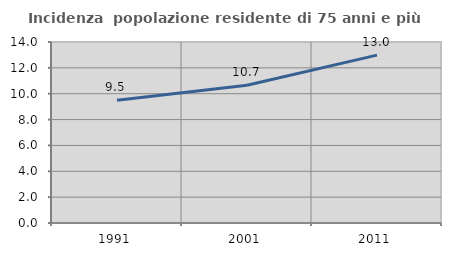
| Category | Incidenza  popolazione residente di 75 anni e più |
|---|---|
| 1991.0 | 9.492 |
| 2001.0 | 10.661 |
| 2011.0 | 12.982 |